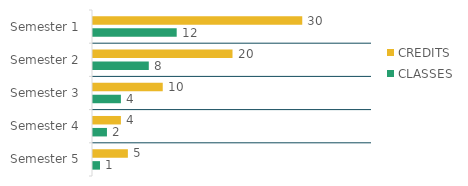
| Category | CREDITS   | CLASSES  |
|---|---|---|
| Semester 1 | 30 | 12 |
| Semester 2 | 20 | 8 |
| Semester 3 | 10 | 4 |
| Semester 4 | 4 | 2 |
| Semester 5 | 5 | 1 |